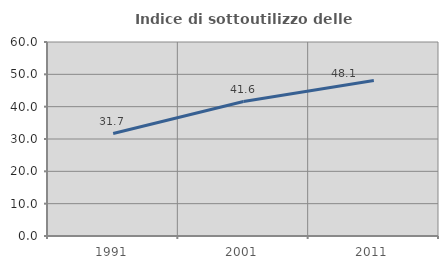
| Category | Indice di sottoutilizzo delle abitazioni  |
|---|---|
| 1991.0 | 31.698 |
| 2001.0 | 41.589 |
| 2011.0 | 48.08 |